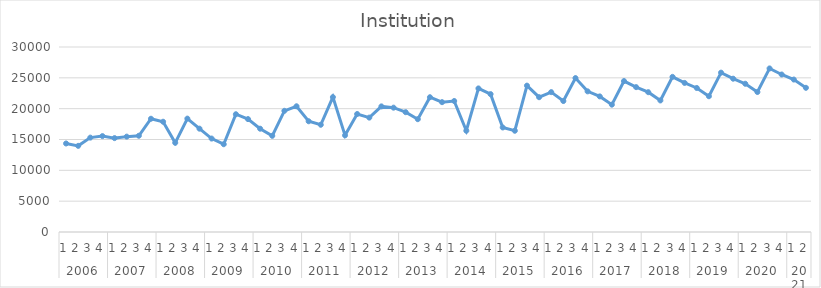
| Category | Institution |
|---|---|
| 0 | 14353 |
| 1 | 13970 |
| 2 | 15305 |
| 3 | 15550 |
| 4 | 15225 |
| 5 | 15465 |
| 6 | 15606 |
| 7 | 18365 |
| 8 | 17880 |
| 9 | 14463 |
| 10 | 18386 |
| 11 | 16757 |
| 12 | 15153 |
| 13 | 14234 |
| 14 | 19098 |
| 15 | 18309 |
| 16 | 16752 |
| 17 | 15594 |
| 18 | 19651 |
| 19 | 20390 |
| 20 | 17957 |
| 21 | 17390 |
| 22 | 21873 |
| 23 | 15675 |
| 24 | 19136 |
| 25 | 18549 |
| 26 | 20370 |
| 27 | 20163 |
| 28 | 19431 |
| 29 | 18295 |
| 30 | 21855 |
| 31 | 21055 |
| 32 | 21242 |
| 33 | 16419 |
| 34 | 23281 |
| 35 | 22359 |
| 36 | 16952 |
| 37 | 16419 |
| 38 | 23731 |
| 39 | 21858 |
| 40 | 22682 |
| 41 | 21237 |
| 42 | 24959 |
| 43 | 22806.72 |
| 44 | 21987.858 |
| 45 | 20648.949 |
| 46 | 24474.404 |
| 47 | 23490.105 |
| 48 | 22671.244 |
| 49 | 21332.335 |
| 50 | 25157.789 |
| 51 | 24173.491 |
| 52 | 23354.629 |
| 53 | 22015.72 |
| 54 | 25841.175 |
| 55 | 24856.876 |
| 56 | 24038.015 |
| 57 | 22699.105 |
| 58 | 26524.56 |
| 59 | 25540.262 |
| 60 | 24721.4 |
| 61 | 23382.491 |